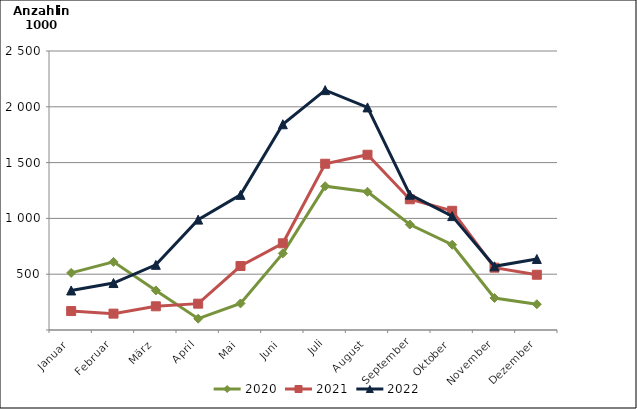
| Category | 2020 | 2021 | 2022 |
|---|---|---|---|
| Januar | 511.664 | 169.711 | 354.337 |
| Februar | 610.406 | 146.648 | 420.848 |
| März | 354.58 | 212.513 | 584.044 |
| April | 101.267 | 236.046 | 989.083 |
| Mai | 237.949 | 573.212 | 1210.892 |
| Juni | 686.258 | 776.698 | 1843.586 |
| Juli | 1288.538 | 1489.747 | 2149.456 |
| August | 1238.599 | 1570.263 | 1994.619 |
| September | 944.835 | 1171.287 | 1212.49 |
| Oktober | 763.936 | 1068.022 | 1020.576 |
| November | 286.844 | 558.324 | 570.6 |
| Dezember | 231.03 | 495.1 | 636.437 |